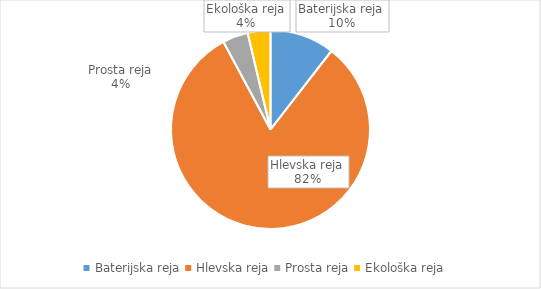
| Category | Količina kosov jajc |
|---|---|
| Baterijska reja | 214453 |
| Hlevska reja | 1668990 |
| Prosta reja | 84767 |
| Ekološka reja | 75668 |